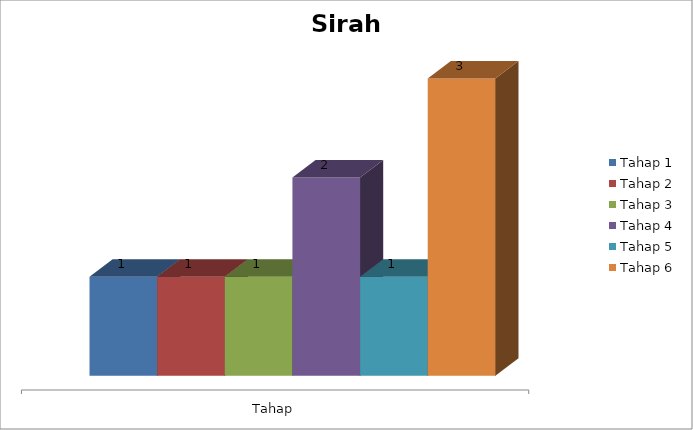
| Category | Tahap 1  | Tahap 2 | Tahap 3 | Tahap 4 | Tahap 5 | Tahap 6 |
|---|---|---|---|---|---|---|
| 0 | 1 | 1 | 1 | 2 | 1 | 3 |